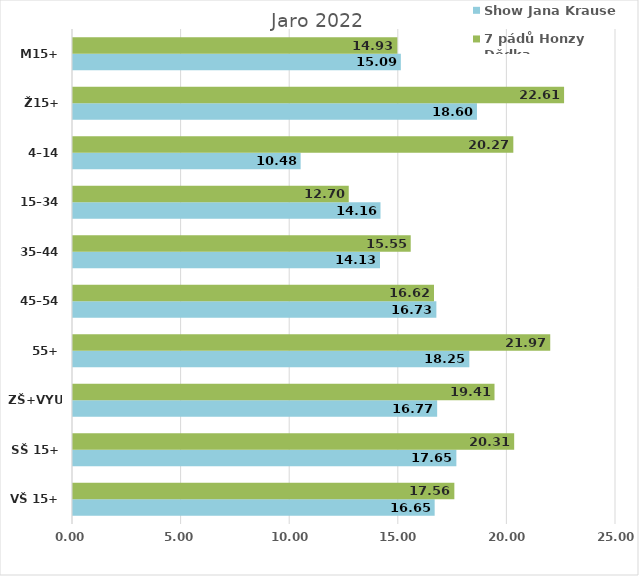
| Category | Show Jana Krause | 7 pádů Honzy Dědka |
|---|---|---|
| VŠ 15+ | 16.651 | 17.558 |
| SŠ 15+ | 17.65 | 20.312 |
| ZŠ+VYUČ | 16.766 | 19.407 |
| 55+ | 18.248 | 21.972 |
| 45–54 | 16.73 | 16.621 |
| 35–44 | 14.135 | 15.549 |
| 15–34 | 14.158 | 12.696 |
| 4–14 | 10.481 | 20.273 |
| Ž15+ | 18.599 | 22.61 |
| M15+ | 15.094 | 14.933 |